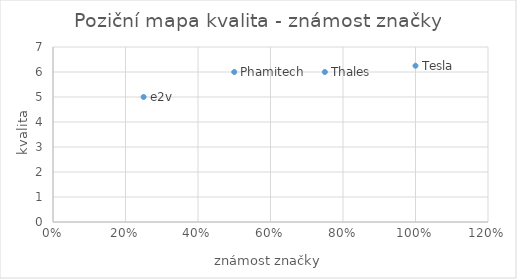
| Category | Series 0 |
|---|---|
| 1.0 | 6.25 |
| 0.75 | 6 |
| 0.25 | 5 |
| 0.5 | 6 |